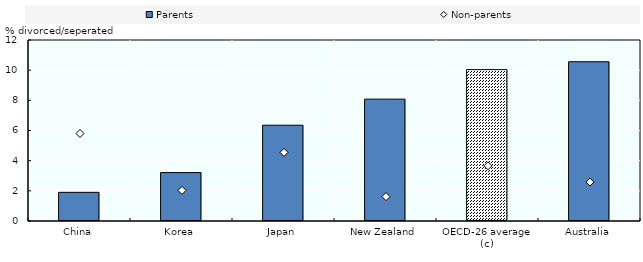
| Category | Parents |
|---|---|
| China | 1.9 |
| Korea | 3.21 |
| Japan | 6.35 |
| New Zealand | 8.08 |
| OECD-26 average (c) | 10.036 |
| Australia | 10.56 |